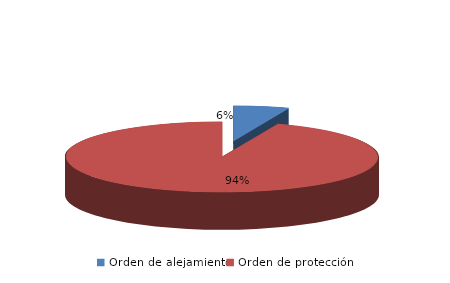
| Category | Series 0 |
|---|---|
| Orden de alejamiento | 2 |
| Orden de protección | 33 |